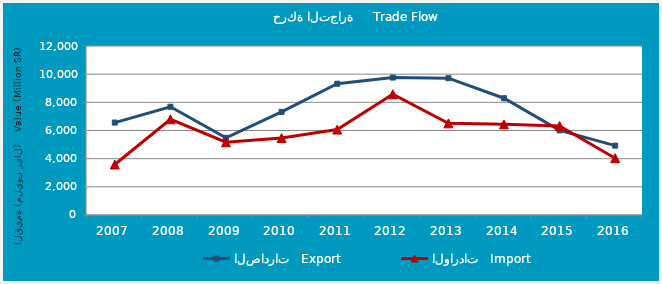
| Category | الصادرات   Export | الواردات   Import |
|---|---|---|
| 2007.0 | 6562.554 | 3584.485 |
| 2008.0 | 7685.853 | 6796.414 |
| 2009.0 | 5482.261 | 5168.536 |
| 2010.0 | 7322.58 | 5467.011 |
| 2011.0 | 9321.64 | 6066.482 |
| 2012.0 | 9757.979 | 8574.247 |
| 2013.0 | 9713.39 | 6509.101 |
| 2014.0 | 8291.134 | 6435.064 |
| 2015.0 | 6008.246 | 6322.07 |
| 2016.0 | 4926.306 | 4034.832 |